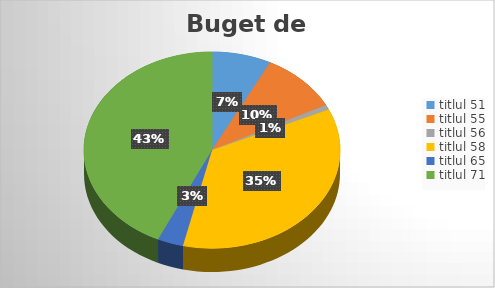
| Category | Series 0 |
|---|---|
| titlul 51 | 1482807 |
| titlul 55 | 1974166 |
| titlul 56 | 154359 |
| titlul 58 | 7031355 |
| titlul 65 | 645951 |
| titlul 71 | 8552228 |